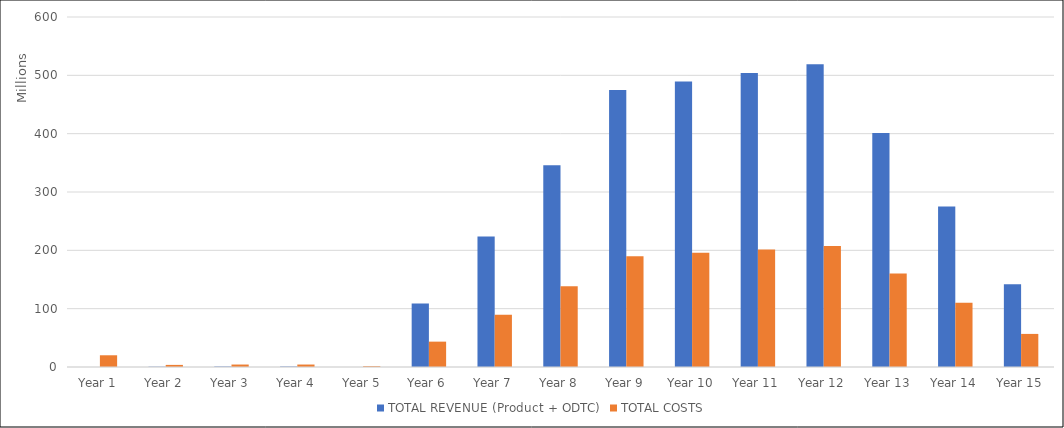
| Category | TOTAL REVENUE (Product + ODTC) | TOTAL COSTS |
|---|---|---|
| 1.0 | 0 | 20.1 |
| 2.0 | 0.5 | 3.6 |
| 3.0 | 0.812 | 4.225 |
| 4.0 | 0.812 | 4.225 |
| 5.0 | 0 | 1.4 |
| 6.0 | 108.682 | 43.473 |
| 7.0 | 223.885 | 89.554 |
| 8.0 | 345.902 | 138.361 |
| 9.0 | 475.039 | 190.016 |
| 10.0 | 489.29 | 195.716 |
| 11.0 | 503.969 | 201.587 |
| 12.0 | 519.088 | 207.635 |
| 13.0 | 400.995 | 160.398 |
| 14.0 | 275.35 | 110.14 |
| 15.0 | 141.805 | 56.722 |